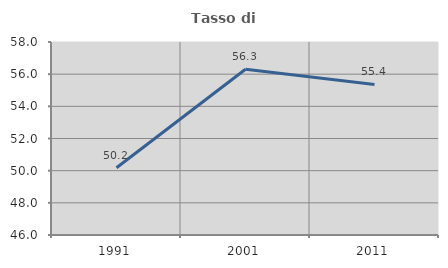
| Category | Tasso di occupazione   |
|---|---|
| 1991.0 | 50.179 |
| 2001.0 | 56.303 |
| 2011.0 | 55.36 |